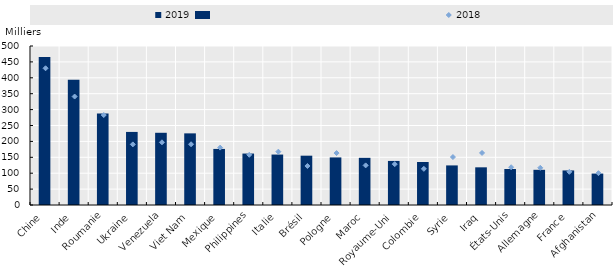
| Category | 2019 |
|---|---|
| Chine | 465.631 |
| Inde | 394.204 |
| Roumanie | 287.692 |
| Ukraine | 229.804 |
| Venezuela | 227.096 |
| Viet Nam | 225.272 |
| Mexique | 176.34 |
| Philippines | 161.783 |
| Italie | 158.636 |
| Brésil | 155.081 |
| Pologne | 149.625 |
| Maroc | 148.361 |
| Royaume-Uni | 138.597 |
| Colombie | 135.256 |
| Syrie | 124.489 |
| Iraq | 118.479 |
| États-Unis | 113.185 |
| Allemagne | 110.683 |
| France | 108.688 |
| Afghanistan | 98.847 |